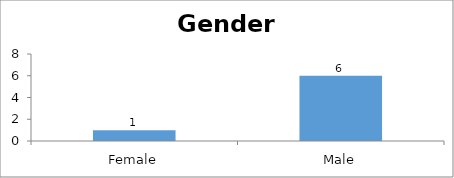
| Category | Gender |
|---|---|
| Female | 1 |
| Male | 6 |